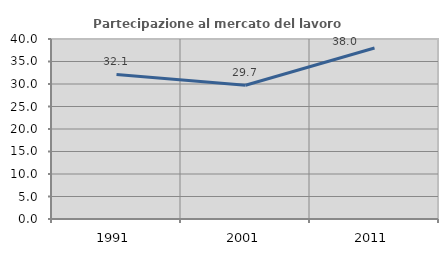
| Category | Partecipazione al mercato del lavoro  femminile |
|---|---|
| 1991.0 | 32.115 |
| 2001.0 | 29.714 |
| 2011.0 | 37.996 |